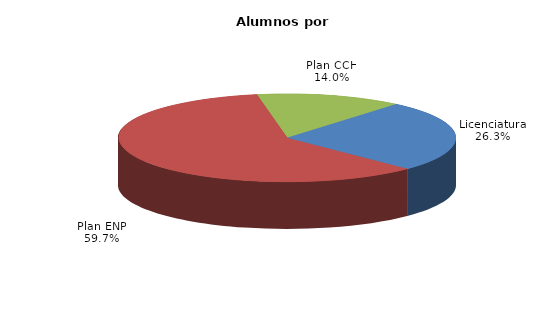
| Category | Series 0 |
|---|---|
| Licenciatura | 20494 |
| Plan ENP | 46537 |
| Plan CCH | 10891 |